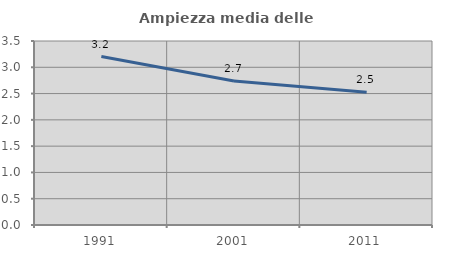
| Category | Ampiezza media delle famiglie |
|---|---|
| 1991.0 | 3.203 |
| 2001.0 | 2.741 |
| 2011.0 | 2.527 |